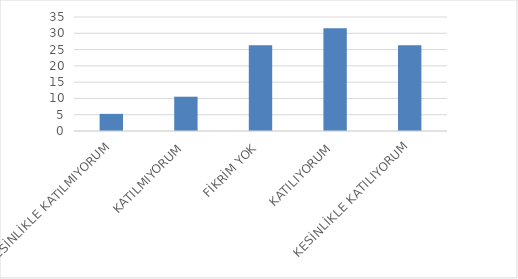
| Category | Series 0 |
|---|---|
| KESİNLİKLE KATILMIYORUM | 5.26 |
| KATILMIYORUM | 10.53 |
| FİKRİM YOK | 26.32 |
| KATILIYORUM | 31.58 |
| KESİNLİKLE KATILIYORUM | 26.32 |